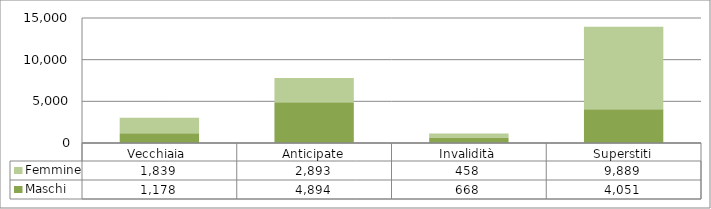
| Category | Maschi | Femmine |
|---|---|---|
| Vecchiaia  | 1178 | 1839 |
| Anticipate | 4894 | 2893 |
| Invalidità | 668 | 458 |
| Superstiti | 4051 | 9889 |